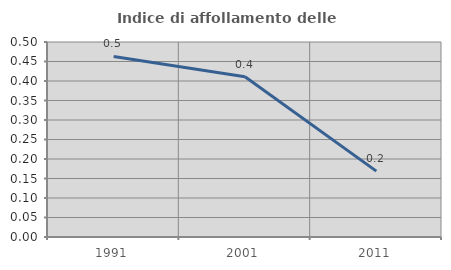
| Category | Indice di affollamento delle abitazioni  |
|---|---|
| 1991.0 | 0.463 |
| 2001.0 | 0.411 |
| 2011.0 | 0.169 |